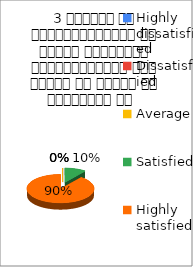
| Category | 3 शिक्षक का विद्यार्थियों के प्रति व्यव्हार मित्रतापूर्ण एवं सहयोग के भावना से परिपूर्ण था   |
|---|---|
| Highly dissatisfied | 0 |
| Dissatisfied | 0 |
| Average | 0 |
| Satisfied | 3 |
| Highly satisfied | 26 |